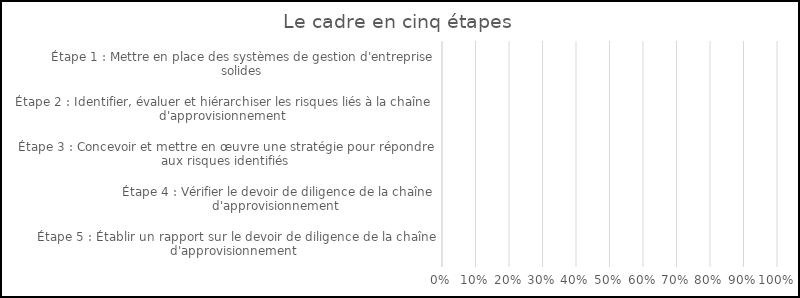
| Category | Red | Yellow | Green |
|---|---|---|---|
| Étape 1 : Mettre en place des systèmes de gestion d'entreprise solides | 0 | 0 | 0 |
| Étape 2 : Identifier, évaluer et hiérarchiser les risques liés à la chaîne d'approvisionnement  | 0 | 0 | 0 |
| Étape 3 : Concevoir et mettre en œuvre une stratégie pour répondre aux risques identifiés | 0 | 0 | 0 |
| Étape 4 : Vérifier le devoir de diligence de la chaîne d'approvisionnement  | 0 | 0 | 0 |
| Étape 5 : Établir un rapport sur le devoir de diligence de la chaîne d'approvisionnement  | 0 | 0 | 0 |